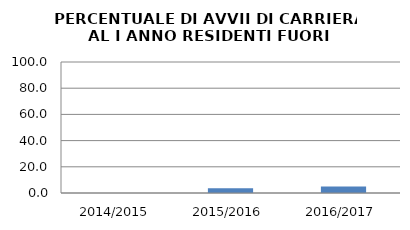
| Category | 2014/2015 2015/2016 2016/2017 |
|---|---|
| 2014/2015 | 0 |
| 2015/2016 | 3.704 |
| 2016/2017 | 5 |